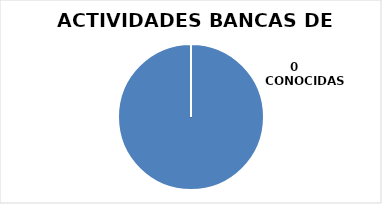
| Category | Series 0 |
|---|---|
| 0 | 257 |
| 1 | 0 |